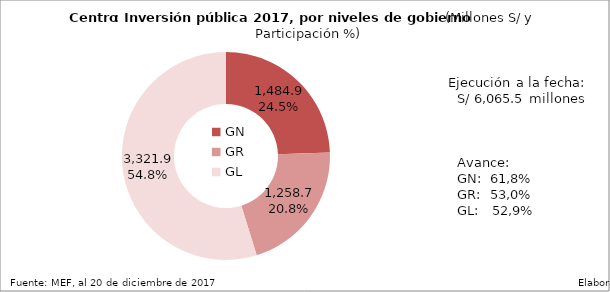
| Category | Ejecutado |
|---|---|
| GN | 1484.853 |
| GR | 1258.693 |
| GL | 3321.931 |